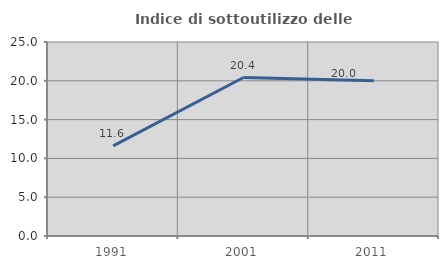
| Category | Indice di sottoutilizzo delle abitazioni  |
|---|---|
| 1991.0 | 11.607 |
| 2001.0 | 20.423 |
| 2011.0 | 20 |